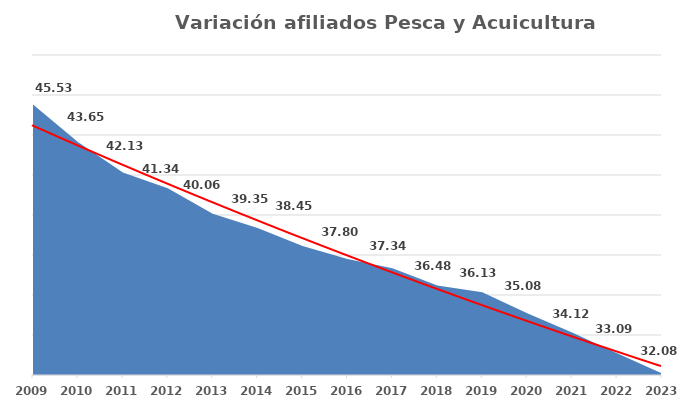
| Category | Series 0 |
|---|---|
| 2009.0 | 45.53 |
| 2010.0 | 43.65 |
| 2011.0 | 42.13 |
| 2012.0 | 41.34 |
| 2013.0 | 40.06 |
| 2014.0 | 39.349 |
| 2015.0 | 38.452 |
| 2016.0 | 37.797 |
| 2017.0 | 37.343 |
| 2018.0 | 36.48 |
| 2019.0 | 36.132 |
| 2020.0 | 35.084 |
| 2021.0 | 34.121 |
| 2022.0 | 33.09 |
| 2023.0 | 32.08 |